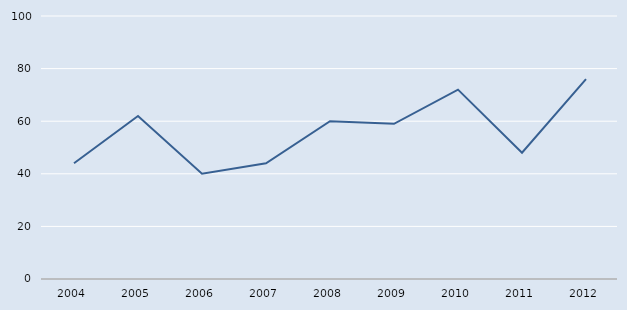
| Category | Series 0 |
|---|---|
| 2004.0 | 44 |
| 2005.0 | 62 |
| 2006.0 | 40 |
| 2007.0 | 44 |
| 2008.0 | 60 |
| 2009.0 | 59 |
| 2010.0 | 72 |
| 2011.0 | 48 |
| 2012.0 | 76 |